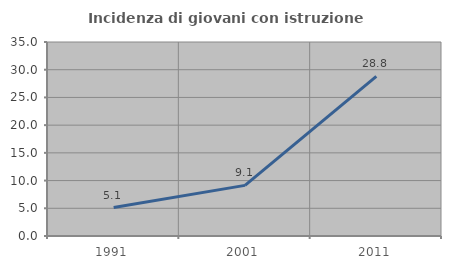
| Category | Incidenza di giovani con istruzione universitaria |
|---|---|
| 1991.0 | 5.128 |
| 2001.0 | 9.132 |
| 2011.0 | 28.814 |